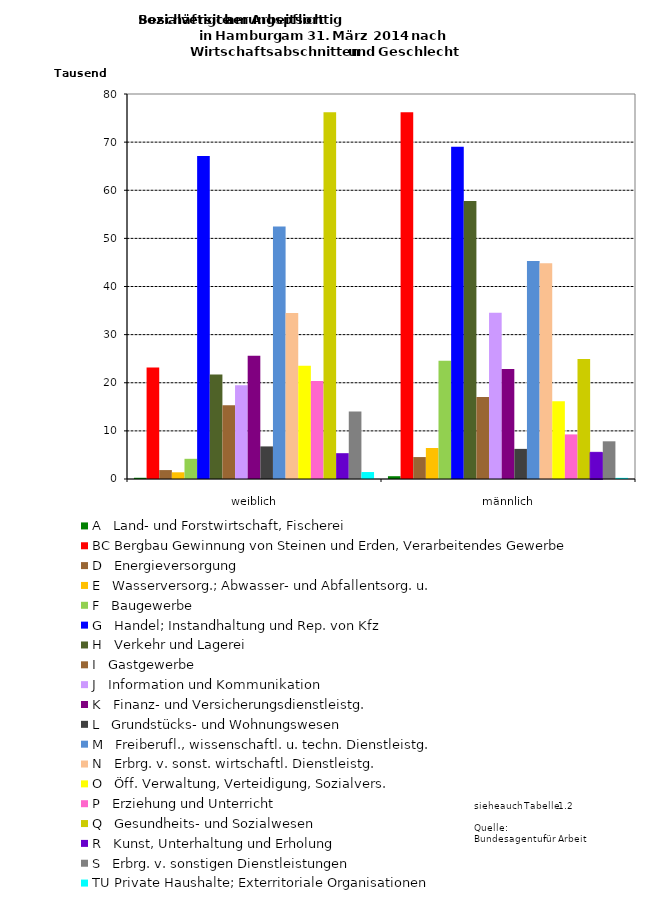
| Category | A   Land- und Forstwirtschaft, Fischerei | BC Bergbau Gewinnung von Steinen und Erden, Verarbeitendes Gewerbe | D   Energieversorgung | E   Wasserversorg.; Abwasser- und Abfallentsorg. u. | F   Baugewerbe | G   Handel; Instandhaltung und Rep. von Kfz | H   Verkehr und Lagerei | I   Gastgewerbe | J   Information und Kommunikation | K   Finanz- und Versicherungsdienstleistg. | L   Grundstücks- und Wohnungswesen | M   Freiberufl., wissenschaftl. u. techn. Dienstleistg. | N   Erbrg. v. sonst. wirtschaftl. Dienstleistg. | O   Öff. Verwaltung, Verteidigung, Sozialvers. | P   Erziehung und Unterricht | Q   Gesundheits- und Sozialwesen | R   Kunst, Unterhaltung und Erholung | S   Erbrg. v. sonstigen Dienstleistungen | TU Private Haushalte; Exterritoriale Organisationen |
|---|---|---|---|---|---|---|---|---|---|---|---|---|---|---|---|---|---|---|---|
| weiblich | 254 | 23181 | 1854 | 1393 | 4198 | 67118 | 21689 | 15307 | 19503 | 25629 | 6772 | 52471 | 34476 | 23509 | 20347 | 76210 | 5364 | 14038 | 1448 |
| männlich | 580 | 76223 | 4558 | 6441 | 24562 | 69035 | 57785 | 17013 | 34543 | 22862 | 6260 | 45294 | 44819 | 16162 | 9265 | 24930 | 5538 | 7833 | 241 |